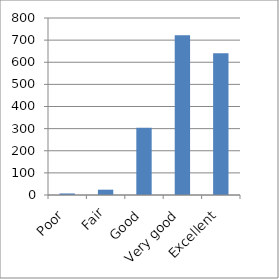
| Category | Series 0 |
|---|---|
| Poor | 7 |
| Fair | 24 |
|  Good | 304 |
| Very good | 722 |
| Excellent | 641 |